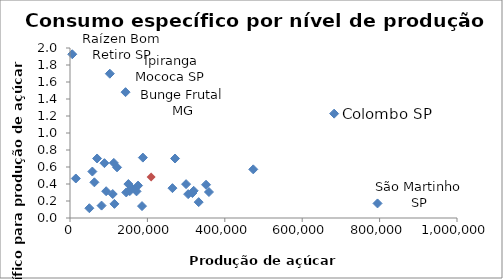
| Category | Series 0 |
|---|---|
| 70006.65 | 0.7 |
| 186093.0 | 0.14 |
| 319615.0 | 0.32 |
| 359096.55 | 0.306 |
| 143551.0 | 1.48 |
| 114752.0 | 0.166 |
| 171877.0 | 0.314 |
| 264721.0 | 0.351 |
| 188278.0 | 0.711 |
| 316300.0 | 0.294 |
| 682500.0 | 1.228 |
| 271424.0 | 0.7 |
| 15000.0 | 0.465 |
| 110416.5 | 0.282 |
| 102893.0 | 1.698 |
| 81621.0 | 0.146 |
| 50000.0 | 0.115 |
| 332500.0 | 0.187 |
| 63000.0 | 0.42 |
| 150820.61 | 0.399 |
| 473527.0 | 0.572 |
| 5852.17 | 1.926 |
| 351434.0 | 0.391 |
| 154544.0 | 0.316 |
| 93442.0 | 0.315 |
| 159076.0 | 0.353 |
| 175898.0 | 0.381 |
| 113212.0 | 0.648 |
| 121590.0 | 0.596 |
| 89000.0 | 0.645 |
| 300000.0 | 0.398 |
| 794644.0 | 0.172 |
| 57750.0 | 0.547 |
| 305311.0 | 0.281 |
| 145381.9 | 0.301 |
| 209575.06800000003 | 0.483 |